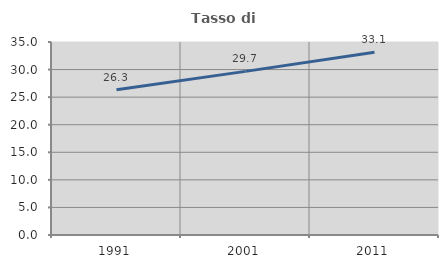
| Category | Tasso di occupazione   |
|---|---|
| 1991.0 | 26.333 |
| 2001.0 | 29.674 |
| 2011.0 | 33.143 |